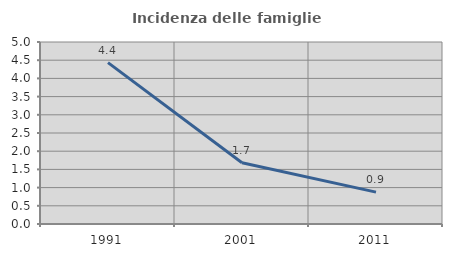
| Category | Incidenza delle famiglie numerose |
|---|---|
| 1991.0 | 4.433 |
| 2001.0 | 1.682 |
| 2011.0 | 0.876 |